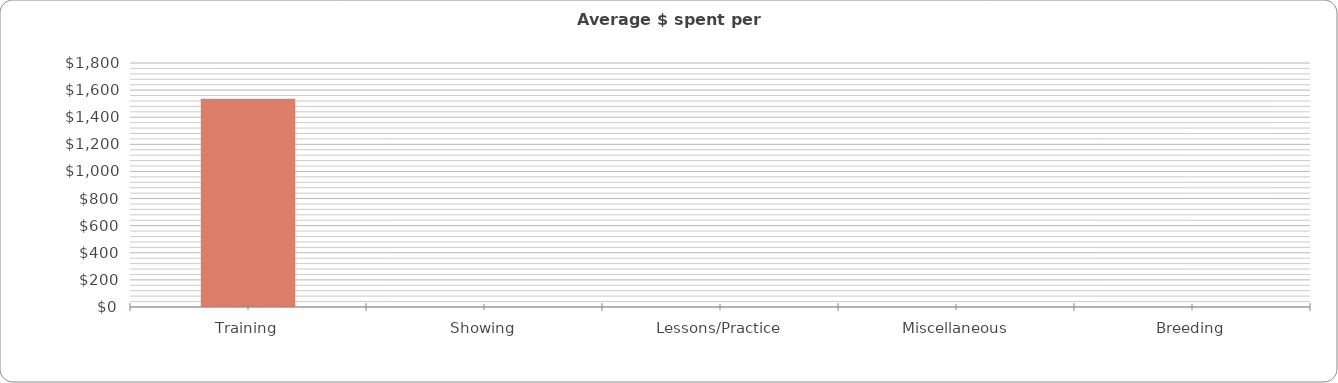
| Category | Series 0 |
|---|---|
| Training | 1536.667 |
| Showing | 0 |
| Lessons/Practice | 0 |
| Miscellaneous | 0 |
| Breeding | 0 |